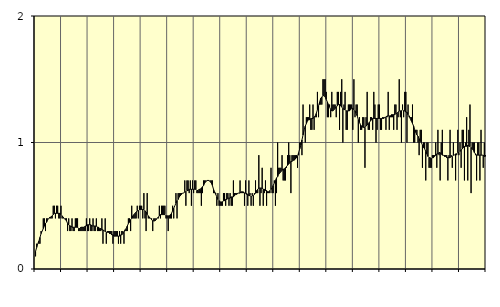
| Category | Fast anställda utomlands | Series 3 |
|---|---|---|
| nan | 0.1 | 0.14 |
| 87.0 | 0.2 | 0.17 |
| 87.0 | 0.2 | 0.2 |
| 87.0 | 0.2 | 0.22 |
| 87.0 | 0.2 | 0.25 |
| 87.0 | 0.3 | 0.28 |
| 87.0 | 0.3 | 0.3 |
| 87.0 | 0.4 | 0.32 |
| 87.0 | 0.4 | 0.34 |
| 87.0 | 0.3 | 0.36 |
| 87.0 | 0.4 | 0.37 |
| 87.0 | 0.4 | 0.39 |
| nan | 0.4 | 0.4 |
| 88.0 | 0.4 | 0.41 |
| 88.0 | 0.4 | 0.41 |
| 88.0 | 0.4 | 0.42 |
| 88.0 | 0.5 | 0.43 |
| 88.0 | 0.5 | 0.44 |
| 88.0 | 0.4 | 0.44 |
| 88.0 | 0.5 | 0.44 |
| 88.0 | 0.5 | 0.44 |
| 88.0 | 0.4 | 0.44 |
| 88.0 | 0.4 | 0.44 |
| 88.0 | 0.5 | 0.43 |
| nan | 0.4 | 0.42 |
| 89.0 | 0.4 | 0.41 |
| 89.0 | 0.4 | 0.4 |
| 89.0 | 0.4 | 0.39 |
| 89.0 | 0.4 | 0.38 |
| 89.0 | 0.3 | 0.36 |
| 89.0 | 0.4 | 0.35 |
| 89.0 | 0.3 | 0.34 |
| 89.0 | 0.3 | 0.34 |
| 89.0 | 0.4 | 0.33 |
| 89.0 | 0.3 | 0.33 |
| 89.0 | 0.3 | 0.33 |
| nan | 0.4 | 0.33 |
| 90.0 | 0.4 | 0.33 |
| 90.0 | 0.4 | 0.33 |
| 90.0 | 0.3 | 0.32 |
| 90.0 | 0.3 | 0.32 |
| 90.0 | 0.3 | 0.33 |
| 90.0 | 0.3 | 0.33 |
| 90.0 | 0.3 | 0.33 |
| 90.0 | 0.3 | 0.33 |
| 90.0 | 0.3 | 0.34 |
| 90.0 | 0.4 | 0.34 |
| 90.0 | 0.3 | 0.35 |
| nan | 0.3 | 0.35 |
| 91.0 | 0.4 | 0.35 |
| 91.0 | 0.3 | 0.35 |
| 91.0 | 0.3 | 0.34 |
| 91.0 | 0.4 | 0.34 |
| 91.0 | 0.3 | 0.34 |
| 91.0 | 0.3 | 0.34 |
| 91.0 | 0.4 | 0.34 |
| 91.0 | 0.3 | 0.33 |
| 91.0 | 0.3 | 0.33 |
| 91.0 | 0.3 | 0.32 |
| 91.0 | 0.3 | 0.32 |
| nan | 0.4 | 0.31 |
| 92.0 | 0.2 | 0.31 |
| 92.0 | 0.3 | 0.3 |
| 92.0 | 0.4 | 0.3 |
| 92.0 | 0.2 | 0.29 |
| 92.0 | 0.3 | 0.29 |
| 92.0 | 0.3 | 0.29 |
| 92.0 | 0.3 | 0.28 |
| 92.0 | 0.3 | 0.28 |
| 92.0 | 0.3 | 0.27 |
| 92.0 | 0.2 | 0.27 |
| 92.0 | 0.3 | 0.26 |
| nan | 0.3 | 0.26 |
| 93.0 | 0.3 | 0.26 |
| 93.0 | 0.3 | 0.26 |
| 93.0 | 0.2 | 0.26 |
| 93.0 | 0.3 | 0.26 |
| 93.0 | 0.2 | 0.27 |
| 93.0 | 0.3 | 0.27 |
| 93.0 | 0.3 | 0.28 |
| 93.0 | 0.2 | 0.29 |
| 93.0 | 0.3 | 0.31 |
| 93.0 | 0.3 | 0.32 |
| 93.0 | 0.3 | 0.34 |
| nan | 0.4 | 0.36 |
| 94.0 | 0.4 | 0.37 |
| 94.0 | 0.3 | 0.39 |
| 94.0 | 0.5 | 0.4 |
| 94.0 | 0.4 | 0.42 |
| 94.0 | 0.4 | 0.43 |
| 94.0 | 0.4 | 0.44 |
| 94.0 | 0.4 | 0.45 |
| 94.0 | 0.5 | 0.46 |
| 94.0 | 0.4 | 0.46 |
| 94.0 | 0.5 | 0.47 |
| 94.0 | 0.5 | 0.47 |
| nan | 0.5 | 0.47 |
| 95.0 | 0.4 | 0.47 |
| 95.0 | 0.6 | 0.47 |
| 95.0 | 0.4 | 0.46 |
| 95.0 | 0.3 | 0.45 |
| 95.0 | 0.6 | 0.43 |
| 95.0 | 0.4 | 0.42 |
| 95.0 | 0.4 | 0.41 |
| 95.0 | 0.4 | 0.4 |
| 95.0 | 0.4 | 0.39 |
| 95.0 | 0.3 | 0.38 |
| 95.0 | 0.4 | 0.38 |
| nan | 0.4 | 0.38 |
| 96.0 | 0.4 | 0.39 |
| 96.0 | 0.4 | 0.4 |
| 96.0 | 0.4 | 0.41 |
| 96.0 | 0.5 | 0.42 |
| 96.0 | 0.4 | 0.43 |
| 96.0 | 0.5 | 0.43 |
| 96.0 | 0.5 | 0.43 |
| 96.0 | 0.5 | 0.43 |
| 96.0 | 0.5 | 0.43 |
| 96.0 | 0.4 | 0.42 |
| 96.0 | 0.4 | 0.42 |
| nan | 0.3 | 0.42 |
| 97.0 | 0.4 | 0.42 |
| 97.0 | 0.4 | 0.43 |
| 97.0 | 0.4 | 0.44 |
| 97.0 | 0.5 | 0.46 |
| 97.0 | 0.4 | 0.48 |
| 97.0 | 0.5 | 0.5 |
| 97.0 | 0.6 | 0.52 |
| 97.0 | 0.4 | 0.54 |
| 97.0 | 0.6 | 0.55 |
| 97.0 | 0.6 | 0.57 |
| 97.0 | 0.6 | 0.58 |
| nan | 0.6 | 0.59 |
| 98.0 | 0.6 | 0.6 |
| 98.0 | 0.6 | 0.6 |
| 98.0 | 0.7 | 0.61 |
| 98.0 | 0.5 | 0.61 |
| 98.0 | 0.7 | 0.62 |
| 98.0 | 0.7 | 0.62 |
| 98.0 | 0.6 | 0.63 |
| 98.0 | 0.7 | 0.63 |
| 98.0 | 0.5 | 0.63 |
| 98.0 | 0.7 | 0.63 |
| 98.0 | 0.6 | 0.63 |
| nan | 0.7 | 0.63 |
| 99.0 | 0.7 | 0.63 |
| 99.0 | 0.6 | 0.62 |
| 99.0 | 0.6 | 0.62 |
| 99.0 | 0.6 | 0.63 |
| 99.0 | 0.6 | 0.63 |
| 99.0 | 0.5 | 0.64 |
| 99.0 | 0.6 | 0.65 |
| 99.0 | 0.7 | 0.66 |
| 99.0 | 0.7 | 0.68 |
| 99.0 | 0.7 | 0.69 |
| 99.0 | 0.7 | 0.7 |
| nan | 0.7 | 0.7 |
| 0.0 | 0.7 | 0.7 |
| 0.0 | 0.7 | 0.69 |
| 0.0 | 0.7 | 0.68 |
| 0.0 | 0.7 | 0.66 |
| 0.0 | 0.6 | 0.63 |
| 0.0 | 0.6 | 0.61 |
| 0.0 | 0.6 | 0.59 |
| 0.0 | 0.5 | 0.57 |
| 0.0 | 0.6 | 0.55 |
| 0.0 | 0.5 | 0.54 |
| 0.0 | 0.5 | 0.53 |
| nan | 0.5 | 0.53 |
| 1.0 | 0.5 | 0.53 |
| 1.0 | 0.6 | 0.54 |
| 1.0 | 0.6 | 0.54 |
| 1.0 | 0.5 | 0.55 |
| 1.0 | 0.6 | 0.55 |
| 1.0 | 0.6 | 0.56 |
| 1.0 | 0.5 | 0.56 |
| 1.0 | 0.6 | 0.56 |
| 1.0 | 0.5 | 0.57 |
| 1.0 | 0.5 | 0.57 |
| 1.0 | 0.7 | 0.57 |
| nan | 0.6 | 0.58 |
| 2.0 | 0.6 | 0.59 |
| 2.0 | 0.6 | 0.59 |
| 2.0 | 0.6 | 0.6 |
| 2.0 | 0.6 | 0.6 |
| 2.0 | 0.7 | 0.6 |
| 2.0 | 0.6 | 0.61 |
| 2.0 | 0.6 | 0.61 |
| 2.0 | 0.6 | 0.61 |
| 2.0 | 0.5 | 0.6 |
| 2.0 | 0.7 | 0.6 |
| 2.0 | 0.6 | 0.59 |
| nan | 0.5 | 0.59 |
| 3.0 | 0.7 | 0.58 |
| 3.0 | 0.6 | 0.58 |
| 3.0 | 0.5 | 0.57 |
| 3.0 | 0.6 | 0.58 |
| 3.0 | 0.5 | 0.58 |
| 3.0 | 0.6 | 0.59 |
| 3.0 | 0.7 | 0.6 |
| 3.0 | 0.6 | 0.62 |
| 3.0 | 0.6 | 0.63 |
| 3.0 | 0.9 | 0.64 |
| 3.0 | 0.5 | 0.64 |
| nan | 0.6 | 0.64 |
| 4.0 | 0.8 | 0.64 |
| 4.0 | 0.5 | 0.63 |
| 4.0 | 0.6 | 0.63 |
| 4.0 | 0.7 | 0.62 |
| 4.0 | 0.5 | 0.62 |
| 4.0 | 0.6 | 0.61 |
| 4.0 | 0.6 | 0.61 |
| 4.0 | 0.6 | 0.62 |
| 4.0 | 0.8 | 0.63 |
| 4.0 | 0.6 | 0.64 |
| 4.0 | 0.6 | 0.66 |
| nan | 0.7 | 0.68 |
| 5.0 | 0.5 | 0.7 |
| 5.0 | 0.6 | 0.72 |
| 5.0 | 1 | 0.73 |
| 5.0 | 0.8 | 0.75 |
| 5.0 | 0.8 | 0.76 |
| 5.0 | 0.8 | 0.77 |
| 5.0 | 0.9 | 0.78 |
| 5.0 | 0.7 | 0.79 |
| 5.0 | 0.7 | 0.79 |
| 5.0 | 0.7 | 0.8 |
| 5.0 | 0.8 | 0.81 |
| nan | 0.9 | 0.82 |
| 6.0 | 1 | 0.83 |
| 6.0 | 0.9 | 0.84 |
| 6.0 | 0.6 | 0.85 |
| 6.0 | 0.9 | 0.85 |
| 6.0 | 0.9 | 0.86 |
| 6.0 | 0.9 | 0.86 |
| 6.0 | 0.9 | 0.87 |
| 6.0 | 0.9 | 0.88 |
| 6.0 | 0.8 | 0.89 |
| 6.0 | 0.9 | 0.92 |
| 6.0 | 1 | 0.95 |
| nan | 1 | 0.98 |
| 7.0 | 0.9 | 1.02 |
| 7.0 | 1.3 | 1.06 |
| 7.0 | 1.1 | 1.1 |
| 7.0 | 1 | 1.13 |
| 7.0 | 1.2 | 1.15 |
| 7.0 | 1.2 | 1.17 |
| 7.0 | 1.2 | 1.18 |
| 7.0 | 1.3 | 1.18 |
| 7.0 | 1.1 | 1.19 |
| 7.0 | 1.1 | 1.19 |
| 7.0 | 1.3 | 1.19 |
| nan | 1.1 | 1.2 |
| 8.0 | 1.2 | 1.21 |
| 8.0 | 1.2 | 1.23 |
| 8.0 | 1.4 | 1.26 |
| 8.0 | 1.2 | 1.29 |
| 8.0 | 1.3 | 1.32 |
| 8.0 | 1.3 | 1.35 |
| 8.0 | 1.3 | 1.36 |
| 8.0 | 1.5 | 1.37 |
| 8.0 | 1.5 | 1.37 |
| 8.0 | 1.5 | 1.36 |
| 8.0 | 1.4 | 1.34 |
| nan | 1.2 | 1.32 |
| 9.0 | 1.2 | 1.3 |
| 9.0 | 1.3 | 1.28 |
| 9.0 | 1.2 | 1.26 |
| 9.0 | 1.4 | 1.25 |
| 9.0 | 1.3 | 1.25 |
| 9.0 | 1.3 | 1.26 |
| 9.0 | 1.3 | 1.27 |
| 9.0 | 1.2 | 1.28 |
| 9.0 | 1.4 | 1.29 |
| 9.0 | 1.4 | 1.3 |
| 9.0 | 1.1 | 1.3 |
| nan | 1.4 | 1.29 |
| 10.0 | 1.5 | 1.28 |
| 10.0 | 1 | 1.27 |
| 10.0 | 1.3 | 1.26 |
| 10.0 | 1.4 | 1.26 |
| 10.0 | 1.1 | 1.25 |
| 10.0 | 1.1 | 1.25 |
| 10.0 | 1.3 | 1.25 |
| 10.0 | 1.3 | 1.25 |
| 10.0 | 1.3 | 1.26 |
| 10.0 | 1.3 | 1.27 |
| 10.0 | 1.1 | 1.27 |
| nan | 1.5 | 1.26 |
| 11.0 | 1.2 | 1.25 |
| 11.0 | 1.3 | 1.23 |
| 11.0 | 1.3 | 1.21 |
| 11.0 | 1 | 1.18 |
| 11.0 | 1.2 | 1.16 |
| 11.0 | 1.1 | 1.14 |
| 11.0 | 1.1 | 1.13 |
| 11.0 | 1.2 | 1.12 |
| 11.0 | 1.2 | 1.12 |
| 11.0 | 0.8 | 1.12 |
| 11.0 | 1.2 | 1.13 |
| nan | 1.4 | 1.14 |
| 12.0 | 1.1 | 1.15 |
| 12.0 | 1.1 | 1.16 |
| 12.0 | 1.2 | 1.17 |
| 12.0 | 1.2 | 1.18 |
| 12.0 | 1.1 | 1.19 |
| 12.0 | 1.4 | 1.19 |
| 12.0 | 1.3 | 1.19 |
| 12.0 | 1 | 1.19 |
| 12.0 | 1.1 | 1.19 |
| 12.0 | 1.3 | 1.19 |
| 12.0 | 1.3 | 1.19 |
| nan | 1.1 | 1.19 |
| 13.0 | 1.1 | 1.19 |
| 13.0 | 1.2 | 1.19 |
| 13.0 | 1.2 | 1.19 |
| 13.0 | 1.2 | 1.2 |
| 13.0 | 1.1 | 1.2 |
| 13.0 | 1.2 | 1.21 |
| 13.0 | 1.4 | 1.21 |
| 13.0 | 1.1 | 1.21 |
| 13.0 | 1.2 | 1.21 |
| 13.0 | 1.2 | 1.22 |
| 13.0 | 1.2 | 1.22 |
| nan | 1.1 | 1.22 |
| 14.0 | 1.3 | 1.22 |
| 14.0 | 1.3 | 1.23 |
| 14.0 | 1.1 | 1.23 |
| 14.0 | 1.2 | 1.24 |
| 14.0 | 1.5 | 1.25 |
| 14.0 | 1.2 | 1.25 |
| 14.0 | 1 | 1.25 |
| 14.0 | 1.3 | 1.26 |
| 14.0 | 1.2 | 1.25 |
| 14.0 | 1.4 | 1.25 |
| 14.0 | 1.4 | 1.24 |
| nan | 1 | 1.24 |
| 15.0 | 1.3 | 1.22 |
| 15.0 | 1.2 | 1.21 |
| 15.0 | 1.2 | 1.19 |
| 15.0 | 1.2 | 1.17 |
| 15.0 | 1.3 | 1.15 |
| 15.0 | 1 | 1.13 |
| 15.0 | 1 | 1.1 |
| 15.0 | 1.1 | 1.08 |
| 15.0 | 1.1 | 1.06 |
| 15.0 | 1 | 1.05 |
| 15.0 | 0.9 | 1.03 |
| nan | 1.1 | 1.01 |
| 16.0 | 1.1 | 1 |
| 16.0 | 0.8 | 0.98 |
| 16.0 | 1 | 0.96 |
| 16.0 | 1 | 0.95 |
| 16.0 | 0.7 | 0.93 |
| 16.0 | 1 | 0.91 |
| 16.0 | 1 | 0.89 |
| 16.0 | 0.8 | 0.88 |
| 16.0 | 0.8 | 0.88 |
| 16.0 | 0.8 | 0.87 |
| 16.0 | 0.9 | 0.88 |
| nan | 0.9 | 0.88 |
| 17.0 | 0.9 | 0.89 |
| 17.0 | 1 | 0.9 |
| 17.0 | 0.8 | 0.91 |
| 17.0 | 1.1 | 0.91 |
| 17.0 | 0.9 | 0.92 |
| 17.0 | 0.7 | 0.92 |
| 17.0 | 1 | 0.91 |
| 17.0 | 1.1 | 0.9 |
| 17.0 | 0.9 | 0.9 |
| 17.0 | 0.9 | 0.89 |
| 17.0 | 0.9 | 0.89 |
| nan | 0.9 | 0.88 |
| 18.0 | 0.7 | 0.88 |
| 18.0 | 0.9 | 0.88 |
| 18.0 | 1.1 | 0.88 |
| 18.0 | 0.9 | 0.89 |
| 18.0 | 0.8 | 0.89 |
| 18.0 | 1 | 0.9 |
| 18.0 | 0.9 | 0.9 |
| 18.0 | 0.7 | 0.91 |
| 18.0 | 0.9 | 0.91 |
| 18.0 | 1.1 | 0.92 |
| 18.0 | 0.9 | 0.92 |
| nan | 1 | 0.93 |
| 19.0 | 0.8 | 0.94 |
| 19.0 | 1.1 | 0.95 |
| 19.0 | 1.1 | 0.96 |
| 19.0 | 0.7 | 0.97 |
| 19.0 | 1 | 0.97 |
| 19.0 | 1.2 | 0.97 |
| 19.0 | 0.7 | 0.98 |
| 19.0 | 1.1 | 0.97 |
| 19.0 | 1.3 | 0.97 |
| 19.0 | 0.6 | 0.96 |
| 19.0 | 1 | 0.95 |
| nan | 1 | 0.94 |
| 20.0 | 1 | 0.92 |
| 20.0 | 0.9 | 0.91 |
| 20.0 | 0.7 | 0.9 |
| 20.0 | 1 | 0.9 |
| 20.0 | 1 | 0.9 |
| 20.0 | 0.7 | 0.9 |
| 20.0 | 1.1 | 0.9 |
| 20.0 | 0.9 | 0.9 |
| 20.0 | 0.8 | 0.9 |
| 20.0 | 1 | 0.89 |
| 20.0 | 0.9 | 0.89 |